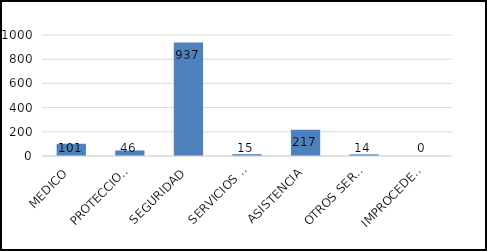
| Category | TOTAL |
|---|---|
| MEDICO | 101 |
| PROTECCION CIVIL | 46 |
| SEGURIDAD | 937 |
| SERVICIOS PUBLICOS | 15 |
| ASISTENCIA | 217 |
| OTROS SERVICIOS | 14 |
| IMPROCEDENTES | 0 |